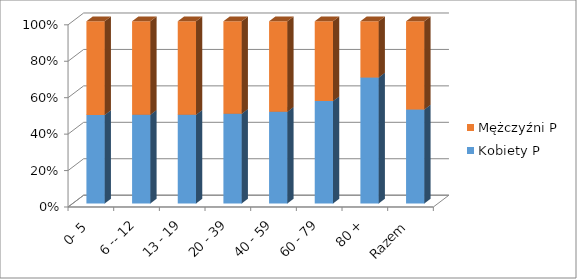
| Category | Kobiety P | Mężczyźni P |
|---|---|---|
| 0- 5 | 0.486 | 0.514 |
| 6 -- 12 | 0.487 | 0.513 |
| 13 - 19 | 0.487 | 0.513 |
| 20 - 39 | 0.492 | 0.508 |
| 40 - 59 | 0.504 | 0.496 |
| 60 - 79 | 0.562 | 0.438 |
| 80 + | 0.692 | 0.308 |
| Razem | 0.516 | 0.484 |